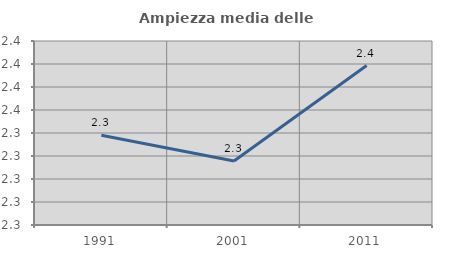
| Category | Ampiezza media delle famiglie |
|---|---|
| 1991.0 | 2.339 |
| 2001.0 | 2.328 |
| 2011.0 | 2.369 |